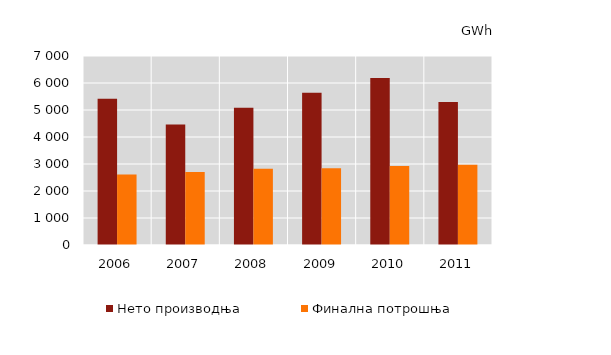
| Category | Нето производња  | Финална потрошња  |
|---|---|---|
| 2006.0 | 5413 | 2608 |
| 2007.0 | 4463 | 2708 |
| 2008.0 | 5087 | 2826 |
| 2009.0 | 5640 | 2847 |
| 2010.0 | 6183 | 2922 |
| 2011.0 | 5298 | 2970 |